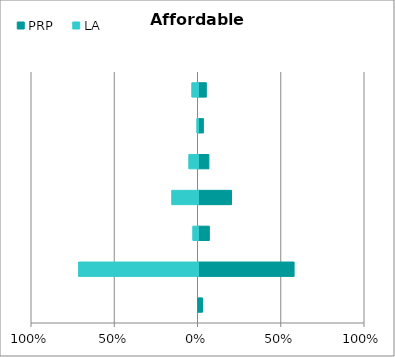
| Category | PRP | LA |
|---|---|---|
| Other | 0.024 | 0 |
| Retired | 0.574 | -0.717 |
| Unemployed (Jobseeker) | 0.065 | -0.03 |
| Unable to work due to sickness | 0.198 | -0.157 |
| Not seeking work | 0.062 | -0.054 |
| Part time worker | 0.029 | -0.006 |
| Full time worker | 0.047 | -0.036 |